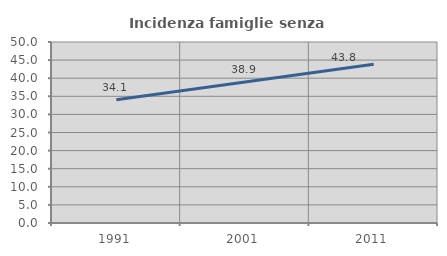
| Category | Incidenza famiglie senza nuclei |
|---|---|
| 1991.0 | 34.052 |
| 2001.0 | 38.937 |
| 2011.0 | 43.834 |